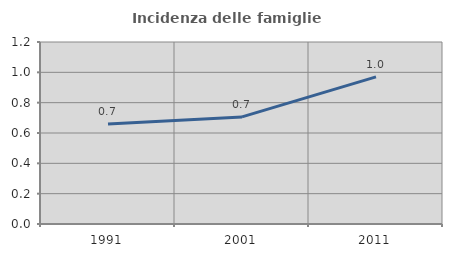
| Category | Incidenza delle famiglie numerose |
|---|---|
| 1991.0 | 0.659 |
| 2001.0 | 0.706 |
| 2011.0 | 0.97 |